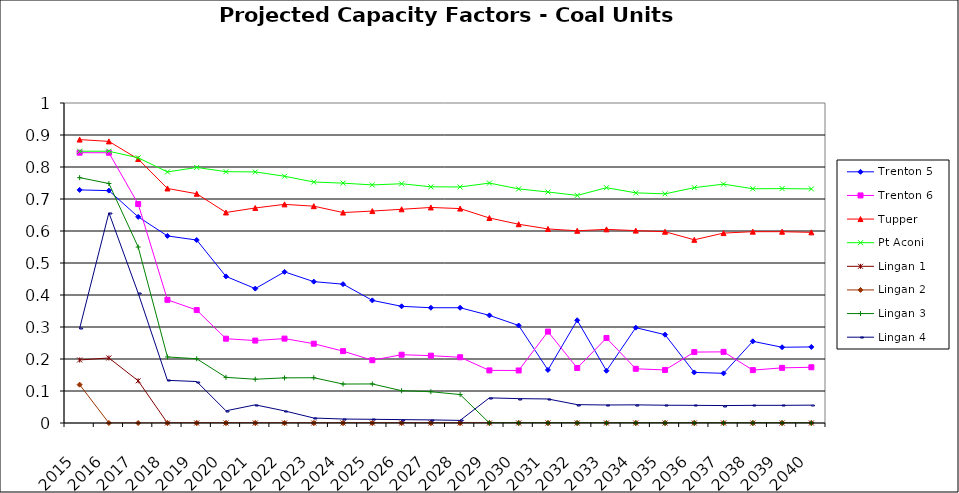
| Category | Trenton 5 | Trenton 6 | Tupper | Pt Aconi | Lingan 1 | Lingan 2 | Lingan 3 | Lingan 4 |
|---|---|---|---|---|---|---|---|---|
| 2015.0 | 0.728 | 0.845 | 0.886 | 0.849 | 0.197 | 0.12 | 0.767 | 0.296 |
| 2016.0 | 0.726 | 0.844 | 0.88 | 0.849 | 0.203 | 0 | 0.748 | 0.657 |
| 2017.0 | 0.644 | 0.684 | 0.825 | 0.829 | 0.132 | 0 | 0.55 | 0.406 |
| 2018.0 | 0.585 | 0.385 | 0.733 | 0.785 | 0 | 0 | 0.206 | 0.133 |
| 2019.0 | 0.572 | 0.353 | 0.716 | 0.799 | 0 | 0 | 0.201 | 0.13 |
| 2020.0 | 0.458 | 0.263 | 0.658 | 0.785 | 0 | 0 | 0.143 | 0.038 |
| 2021.0 | 0.42 | 0.258 | 0.672 | 0.785 | 0 | 0 | 0.137 | 0.057 |
| 2022.0 | 0.472 | 0.264 | 0.683 | 0.771 | 0 | 0 | 0.141 | 0.038 |
| 2023.0 | 0.442 | 0.248 | 0.678 | 0.753 | 0 | 0 | 0.141 | 0.016 |
| 2024.0 | 0.434 | 0.225 | 0.658 | 0.75 | 0 | 0 | 0.122 | 0.012 |
| 2025.0 | 0.383 | 0.196 | 0.662 | 0.744 | 0 | 0 | 0.122 | 0.012 |
| 2026.0 | 0.365 | 0.213 | 0.668 | 0.748 | 0 | 0 | 0.101 | 0.011 |
| 2027.0 | 0.36 | 0.21 | 0.674 | 0.738 | 0 | 0 | 0.098 | 0.01 |
| 2028.0 | 0.36 | 0.205 | 0.67 | 0.738 | 0 | 0 | 0.089 | 0.008 |
| 2029.0 | 0.336 | 0.164 | 0.641 | 0.75 | 0 | 0 | 0 | 0.079 |
| 2030.0 | 0.305 | 0.164 | 0.621 | 0.732 | 0 | 0 | 0 | 0.076 |
| 2031.0 | 0.166 | 0.286 | 0.606 | 0.722 | 0 | 0 | 0 | 0.075 |
| 2032.0 | 0.321 | 0.172 | 0.601 | 0.711 | 0 | 0 | 0 | 0.057 |
| 2033.0 | 0.163 | 0.266 | 0.605 | 0.735 | 0 | 0 | 0 | 0.056 |
| 2034.0 | 0.298 | 0.169 | 0.601 | 0.719 | 0 | 0 | 0 | 0.057 |
| 2035.0 | 0.276 | 0.166 | 0.598 | 0.716 | 0 | 0 | 0 | 0.056 |
| 2036.0 | 0.158 | 0.222 | 0.572 | 0.735 | 0 | 0 | 0 | 0.055 |
| 2037.0 | 0.155 | 0.222 | 0.593 | 0.746 | 0 | 0 | 0 | 0.054 |
| 2038.0 | 0.255 | 0.165 | 0.598 | 0.732 | 0 | 0 | 0 | 0.055 |
| 2039.0 | 0.237 | 0.172 | 0.598 | 0.732 | 0 | 0 | 0 | 0.055 |
| 2040.0 | 0.238 | 0.174 | 0.596 | 0.732 | 0 | 0 | 0 | 0.056 |